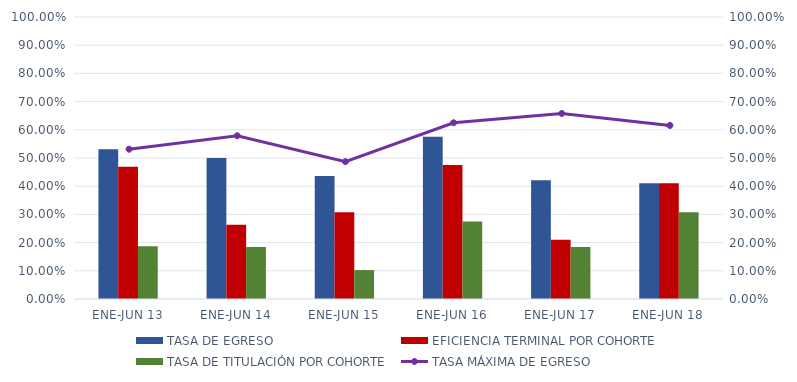
| Category | TASA DE EGRESO | EFICIENCIA TERMINAL POR COHORTE | TASA DE TITULACIÓN POR COHORTE |
|---|---|---|---|
| ENE-JUN 13 | 0.531 | 0.469 | 0.188 |
| ENE-JUN 14 | 0.5 | 0.263 | 0.184 |
| ENE-JUN 15 | 0.436 | 0.308 | 0.103 |
| ENE-JUN 16 | 0.575 | 0.475 | 0.275 |
| ENE-JUN 17 | 0.421 | 0.211 | 0.184 |
| ENE-JUN 18 | 0.41 | 0.41 | 0.308 |